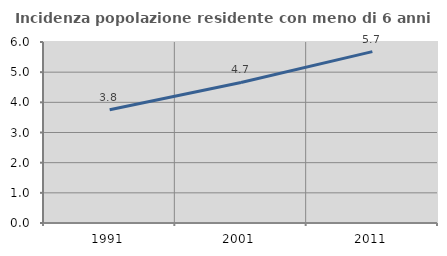
| Category | Incidenza popolazione residente con meno di 6 anni |
|---|---|
| 1991.0 | 3.755 |
| 2001.0 | 4.658 |
| 2011.0 | 5.682 |